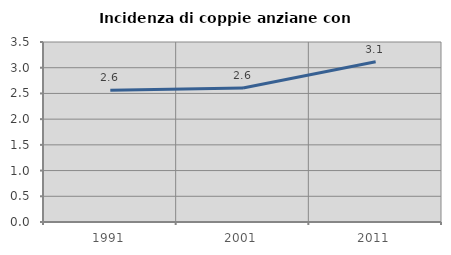
| Category | Incidenza di coppie anziane con figli |
|---|---|
| 1991.0 | 2.564 |
| 2001.0 | 2.606 |
| 2011.0 | 3.114 |